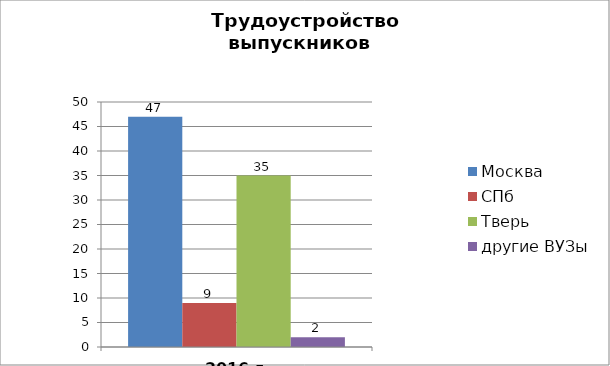
| Category | Москва | СПб | Тверь | другие ВУЗы |
|---|---|---|---|---|
| 2016 г. | 47 | 9 | 35 | 2 |